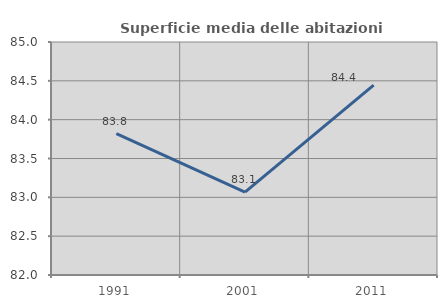
| Category | Superficie media delle abitazioni occupate |
|---|---|
| 1991.0 | 83.821 |
| 2001.0 | 83.067 |
| 2011.0 | 84.445 |